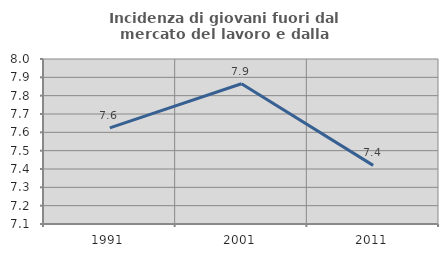
| Category | Incidenza di giovani fuori dal mercato del lavoro e dalla formazione  |
|---|---|
| 1991.0 | 7.624 |
| 2001.0 | 7.865 |
| 2011.0 | 7.42 |